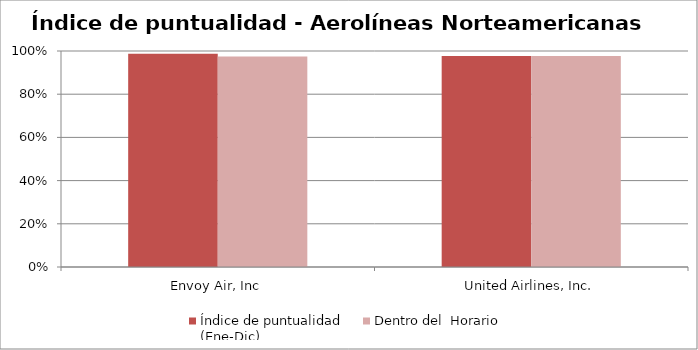
| Category | Índice de puntualidad
(Ene-Dic) | Dentro del  Horario |
|---|---|---|
| Envoy Air, Inc | 0.987 | 0.975 |
| United Airlines, Inc. | 0.976 | 0.976 |